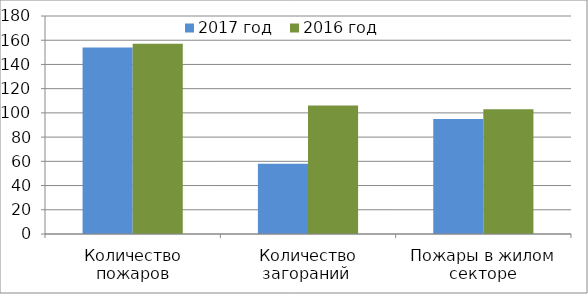
| Category | 2017 год | 2016 год |
|---|---|---|
| Количество пожаров | 154 | 157 |
| Количество загораний  | 58 | 106 |
| Пожары в жилом секторе | 95 | 103 |